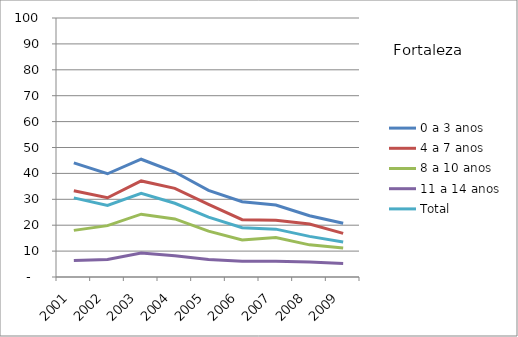
| Category | 0 a 3 anos | 4 a 7 anos | 8 a 10 anos | 11 a 14 anos | Total |
|---|---|---|---|---|---|
| 2001.0 | 44.09 | 33.29 | 18 | 6.37 | 30.54 |
| 2002.0 | 39.86 | 30.58 | 19.83 | 6.77 | 27.65 |
| 2003.0 | 45.47 | 37.09 | 24.26 | 9.3 | 32.34 |
| 2004.0 | 40.53 | 34.23 | 22.42 | 8.18 | 28.47 |
| 2005.0 | 33.46 | 28.05 | 17.7 | 6.74 | 23.12 |
| 2006.0 | 29.06 | 22.11 | 14.31 | 6.1 | 19.02 |
| 2007.0 | 27.82 | 21.92 | 15.21 | 6.08 | 18.48 |
| 2008.0 | 23.67 | 20.43 | 12.41 | 5.82 | 15.68 |
| 2009.0 | 20.75 | 16.85 | 11.18 | 5.24 | 13.51 |